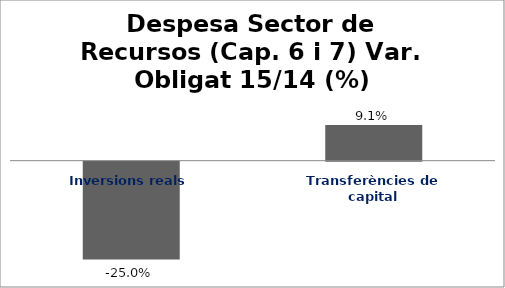
| Category | Series 0 |
|---|---|
| Inversions reals | -0.25 |
| Transferències de capital | 0.091 |